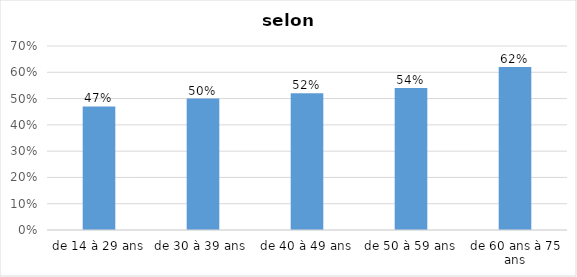
| Category | Series 0 |
|---|---|
| de 14 à 29 ans | 0.47 |
| de 30 à 39 ans  | 0.5 |
| de 40 à 49 ans | 0.52 |
| de 50 à 59 ans | 0.54 |
| de 60 ans à 75 ans | 0.62 |